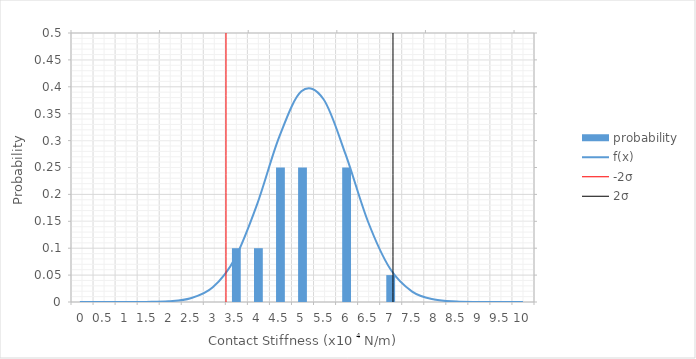
| Category | probability |
|---|---|
| 0.0 | 0 |
| 0.5 | 0 |
| 1.0 | 0 |
| 1.5 | 0 |
| 2.0 | 0 |
| 2.5 | 0 |
| 3.0 | 0 |
| 3.5 | 0.1 |
| 4.0 | 0.1 |
| 4.5 | 0.25 |
| 5.0 | 0.25 |
| 5.5 | 0 |
| 6.0 | 0.25 |
| 6.5 | 0 |
| 7.0 | 0.05 |
| 7.5 | 0 |
| 8.0 | 0 |
| 8.5 | 0 |
| 9.0 | 0 |
| 9.5 | 0 |
| 10.0 | 0 |